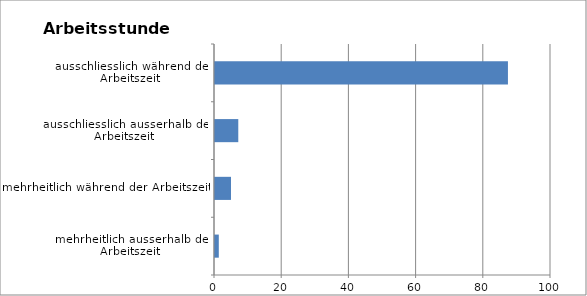
| Category | Series 0 |
|---|---|
| mehrheitlich ausserhalb der Arbeitszeit  | 1.13 |
| mehrheitlich während der Arbeitszeit  | 4.754 |
| ausschliesslich ausserhalb der Arbeitszeit  | 6.93 |
| ausschliesslich während der Arbeitszeit  | 87.186 |